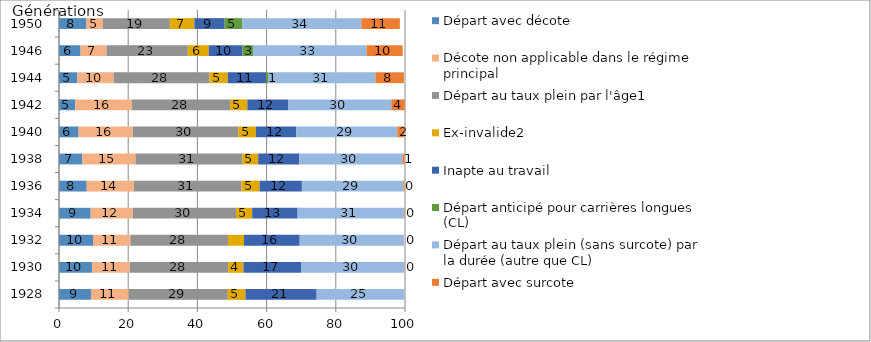
| Category | Départ avec décote | Décote non applicable dans le régime principal  | Départ au taux plein par l'âge1 | Ex-invalide2 | Inapte au travail | Départ anticipé pour carrières longues (CL) | Départ au taux plein (sans surcote) par la durée (autre que CL) | Départ avec surcote |
|---|---|---|---|---|---|---|---|---|
| 1928.0 | 9.269 | 10.864 | 28.653 | 5.102 | 20.581 | 0 | 25.335 | 0 |
| 1930.0 | 9.6 | 10.885 | 28.406 | 4.407 | 16.659 | 0 | 29.769 | 0.077 |
| 1932.0 | 9.834 | 10.824 | 28.171 | 4.651 | 16.09 | 0 | 30.065 | 0.04 |
| 1934.0 | 9.153 | 12.142 | 29.858 | 4.668 | 13.146 | 0 | 30.7 | 0.205 |
| 1936.0 | 8.016 | 13.675 | 31.059 | 5.214 | 12.238 | 0 | 29.344 | 0.323 |
| 1938.0 | 6.732 | 15.377 | 30.913 | 4.542 | 11.909 | 0 | 29.799 | 0.58 |
| 1940.0 | 5.671 | 15.66 | 30.446 | 5.138 | 11.694 | 0 | 29.181 | 2.002 |
| 1942.0 | 4.724 | 16.395 | 28.343 | 4.967 | 11.898 | 0 | 29.714 | 3.887 |
| 1944.0 | 5.346 | 10.465 | 27.651 | 5.306 | 11.133 | 0.693 | 30.853 | 8.219 |
| 1946.0 | 6.245 | 7.497 | 23.482 | 6.043 | 9.715 | 3.123 | 32.776 | 10.451 |
| 1950.0 | 7.953 | 4.731 | 19.348 | 7.083 | 8.761 | 5.131 | 34.375 | 11.129 |